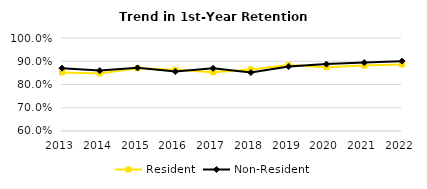
| Category | Resident | Non-Resident |
|---|---|---|
| 2013.0 | 0.852 | 0.87 |
| 2014.0 | 0.848 | 0.86 |
| 2015.0 | 0.87 | 0.872 |
| 2016.0 | 0.863 | 0.856 |
| 2017.0 | 0.852 | 0.87 |
| 2018.0 | 0.865 | 0.851 |
| 2019.0 | 0.884 | 0.877 |
| 2020.0 | 0.874 | 0.888 |
| 2021.0 | 0.881 | 0.894 |
| 2022.0 | 0.886 | 0.901 |